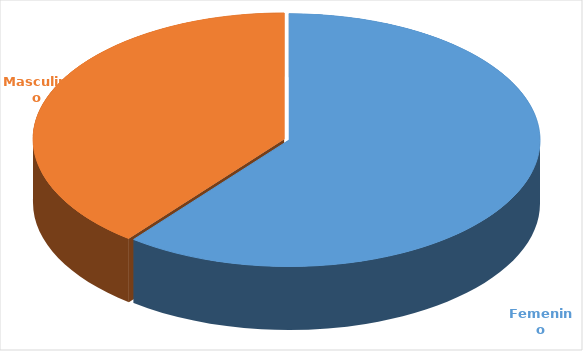
| Category | Cantidad  |
|---|---|
| Femenino | 3577 |
| Masculino | 2325 |